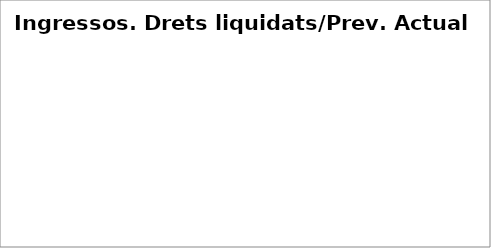
| Category | Series 0 |
|---|---|
| Impostos directes** | 0.035 |
| Impostos indirectes** | 0.08 |
| Taxes, preus públics i altres ingressos | 0.021 |
| Transferències corrents** | 0.075 |
| Ingressos patrimonials | 0.031 |
| Venda d'inversions reals | 0 |
| Transferències de capital | 0 |
| Actius financers* | 0 |
| Passius financers | 0.001 |